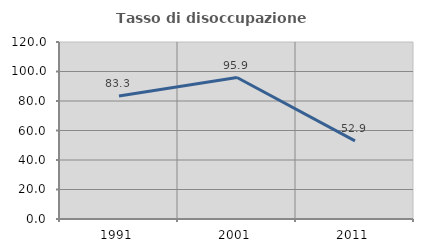
| Category | Tasso di disoccupazione giovanile  |
|---|---|
| 1991.0 | 83.333 |
| 2001.0 | 95.918 |
| 2011.0 | 52.941 |